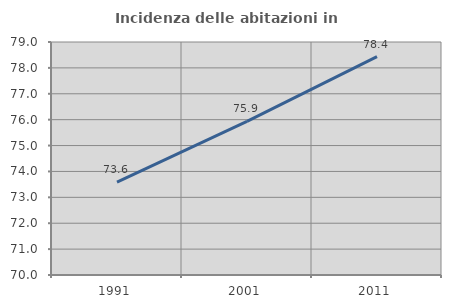
| Category | Incidenza delle abitazioni in proprietà  |
|---|---|
| 1991.0 | 73.589 |
| 2001.0 | 75.931 |
| 2011.0 | 78.432 |